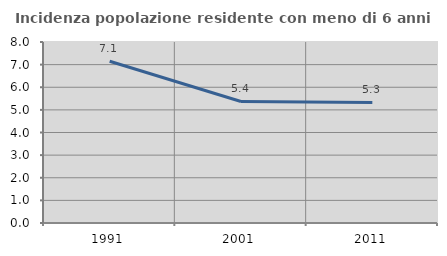
| Category | Incidenza popolazione residente con meno di 6 anni |
|---|---|
| 1991.0 | 7.15 |
| 2001.0 | 5.372 |
| 2011.0 | 5.327 |